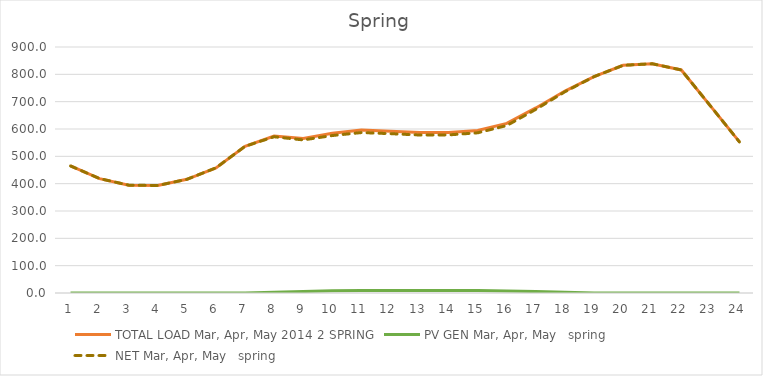
| Category | TOTAL LOAD | PV GEN | NET |
|---|---|---|---|
| 0 | 464.834 | 0 | 464.834 |
| 1 | 418.569 | 0 | 418.569 |
| 2 | 394.582 | 0 | 394.582 |
| 3 | 393.367 | 0 | 393.367 |
| 4 | 415.895 | 0 | 415.895 |
| 5 | 457.896 | 0.001 | 457.895 |
| 6 | 536.876 | 0.216 | 536.659 |
| 7 | 573.981 | 2.407 | 571.574 |
| 8 | 565.367 | 5.316 | 560.051 |
| 9 | 584.075 | 7.987 | 576.088 |
| 10 | 596.178 | 9.23 | 586.949 |
| 11 | 592.08 | 9.176 | 582.905 |
| 12 | 587.066 | 9.028 | 578.038 |
| 13 | 587.328 | 8.917 | 578.411 |
| 14 | 594.811 | 8.754 | 586.057 |
| 15 | 620.457 | 7.755 | 612.703 |
| 16 | 677.107 | 5.124 | 671.983 |
| 17 | 738.885 | 2.5 | 736.386 |
| 18 | 791.798 | 0.255 | 791.542 |
| 19 | 832.917 | 0 | 832.917 |
| 20 | 838.816 | 0 | 838.816 |
| 21 | 816.092 | 0 | 816.092 |
| 22 | 684.696 | 0 | 684.696 |
| 23 | 552.744 | 0 | 552.744 |